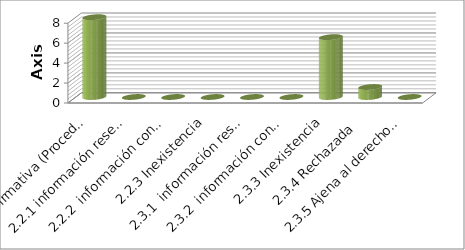
| Category | Series 0 |
|---|---|
| 2.1 Afirmativa (Procedente) | 8 |
| 2.2.1 información reservada | 0 |
| 2.2.2  información confidencial | 0 |
| 2.2.3 Inexistencia | 0 |
| 2.3.1  información reservada | 0 |
| 2.3.2  información confidencial | 0 |
| 2.3.3 Inexistencia | 6 |
| 2.3.4 Rechazada  | 1 |
| 2.3.5 Ajena al derecho de Inf. | 0 |